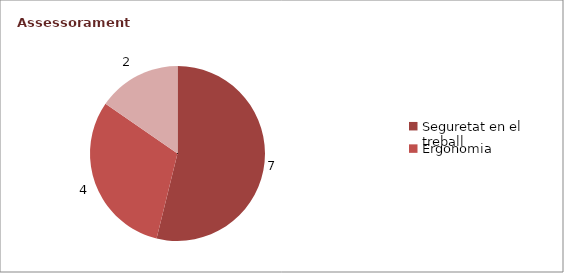
| Category | Series 0 |
|---|---|
| Seguretat en el treball | 7 |
| Ergonomia | 4 |
| Emergències | 2 |